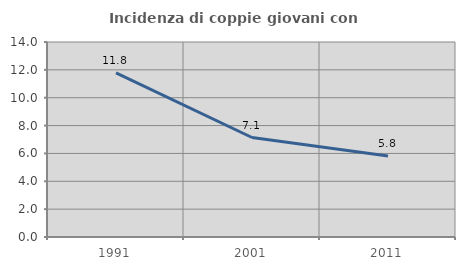
| Category | Incidenza di coppie giovani con figli |
|---|---|
| 1991.0 | 11.782 |
| 2001.0 | 7.143 |
| 2011.0 | 5.814 |